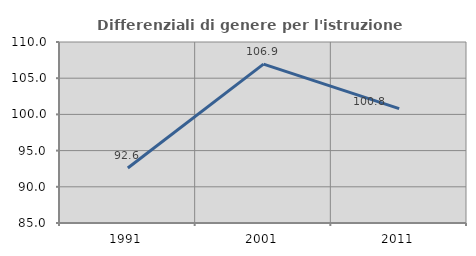
| Category | Differenziali di genere per l'istruzione superiore |
|---|---|
| 1991.0 | 92.599 |
| 2001.0 | 106.948 |
| 2011.0 | 100.8 |